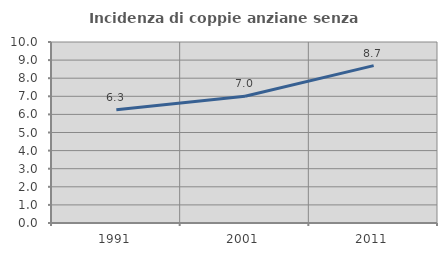
| Category | Incidenza di coppie anziane senza figli  |
|---|---|
| 1991.0 | 6.26 |
| 2001.0 | 7.007 |
| 2011.0 | 8.696 |